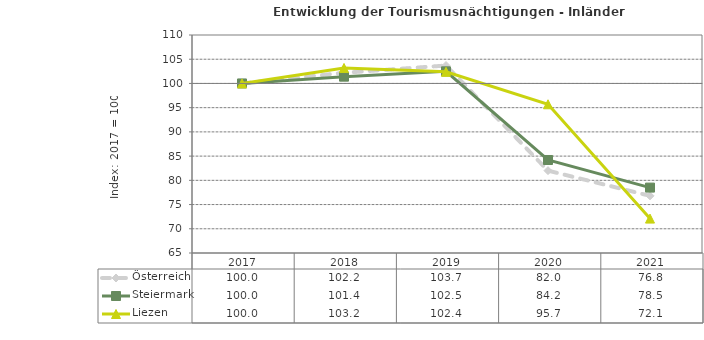
| Category | Österreich | Steiermark | Liezen |
|---|---|---|---|
| 2021.0 | 76.8 | 78.5 | 72.1 |
| 2020.0 | 82 | 84.2 | 95.7 |
| 2019.0 | 103.7 | 102.5 | 102.4 |
| 2018.0 | 102.2 | 101.4 | 103.2 |
| 2017.0 | 100 | 100 | 100 |